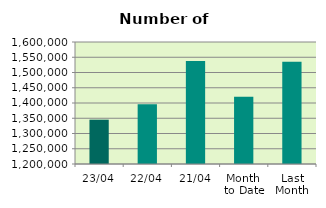
| Category | Series 0 |
|---|---|
| 23/04 | 1345320 |
| 22/04 | 1395642 |
| 21/04 | 1537350 |
| Month 
to Date | 1420830.133 |
| Last
Month | 1535393.739 |